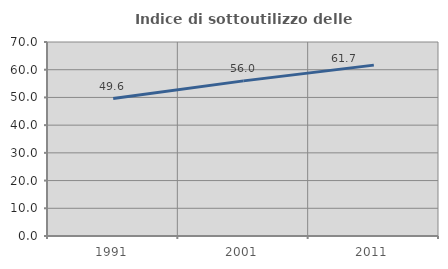
| Category | Indice di sottoutilizzo delle abitazioni  |
|---|---|
| 1991.0 | 49.593 |
| 2001.0 | 55.97 |
| 2011.0 | 61.654 |